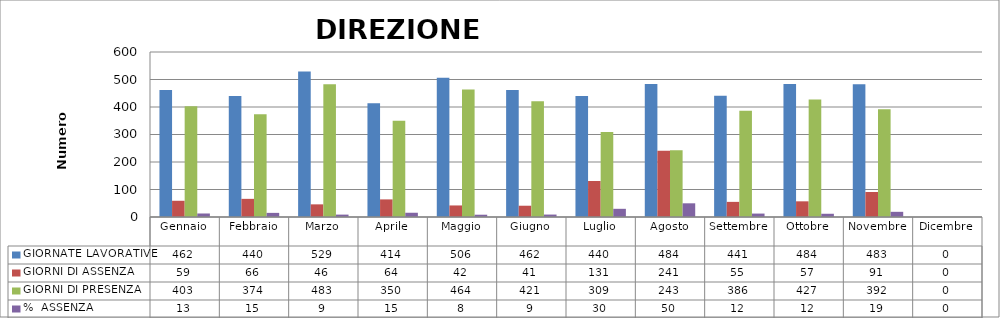
| Category | GIORNATE LAVORATIVE | GIORNI DI ASSENZA | GIORNI DI PRESENZA | %  ASSENZA |
|---|---|---|---|---|
| Gennaio | 462 | 59 | 403 | 12.771 |
| Febbraio | 440 | 66 | 374 | 15 |
| Marzo | 529 | 46 | 483 | 8.696 |
| Aprile | 414 | 64 | 350 | 15.459 |
| Maggio | 506 | 42 | 464 | 8.3 |
| Giugno | 462 | 41 | 421 | 8.874 |
| Luglio | 440 | 131 | 309 | 29.773 |
| Agosto | 484 | 241 | 243 | 49.793 |
| Settembre | 441 | 55 | 386 | 12.472 |
| Ottobre | 484 | 57 | 427 | 11.777 |
| Novembre | 483 | 91 | 392 | 18.841 |
| Dicembre | 0 | 0 | 0 | 0 |